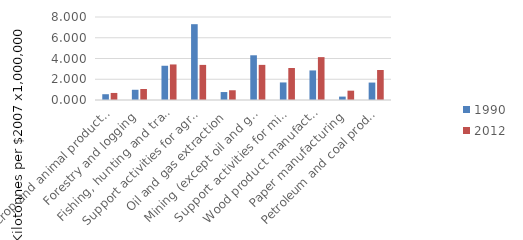
| Category | 1990 | 2012 |
|---|---|---|
| Crop and animal production | 0.557 | 0.68 |
| Forestry and logging | 0.985 | 1.062 |
| Fishing, hunting and trapping | 3.301 | 3.426 |
| Support activities for agriculture and forestry | 7.307 | 3.383 |
| Oil and gas extraction | 0.767 | 0.938 |
| Mining (except oil and gas) | 4.31 | 3.386 |
| Support activities for mining and oil and gas | 1.692 | 3.083 |
| Wood product manufacturing | 2.85 | 4.132 |
| Paper manufacturing | 0.328 | 0.899 |
| Petroleum and coal products manufacturing | 1.68 | 2.892 |